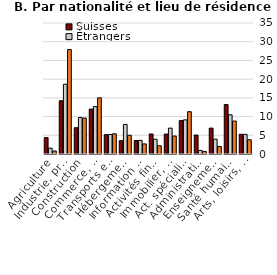
| Category | Suisses | Étrangers | Travailleurs transfrontaliers |
|---|---|---|---|
| Agriculture | 4.375 | 1.561 | 0.8 |
| Industrie, prod. d'énergie | 14.23 | 18.645 | 27.9 |
| Construction | 7.018 | 9.745 | 9.6 |
| Commerce, réparation | 12 | 12.675 | 15 |
| Transports et entreposage | 5.172 | 5.204 | 5.4 |
| Hébergement et restauration | 3.542 | 7.905 | 5 |
| Information et communication | 3.603 | 3.63 | 2.7 |
| Activités financières et d'assurance | 5.349 | 3.956 | 2.2 |
| Immobilier, activités administratives | 5.329 | 6.909 | 4.8 |
| Act. spécialisées, scient. et techn. | 8.93 | 9.12 | 11.3 |
| Administration publique | 5.066 | 0.96 | 0.7 |
| Enseignement | 6.92 | 3.962 | 2 |
| Santé humaine et action sociale | 13.201 | 10.483 | 8.8 |
| Arts, loisirs, ménages privés, autres | 5.265 | 5.245 | 3.8 |